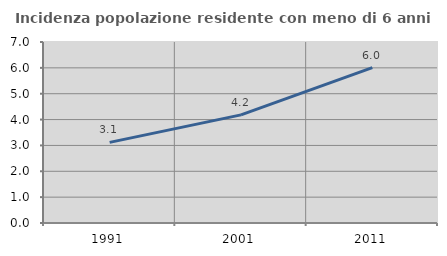
| Category | Incidenza popolazione residente con meno di 6 anni |
|---|---|
| 1991.0 | 3.118 |
| 2001.0 | 4.183 |
| 2011.0 | 6.008 |